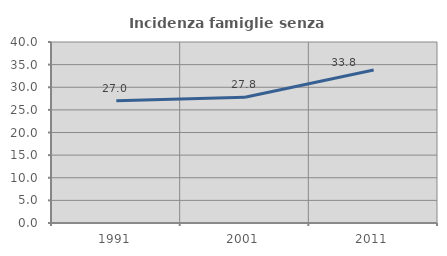
| Category | Incidenza famiglie senza nuclei |
|---|---|
| 1991.0 | 26.997 |
| 2001.0 | 27.792 |
| 2011.0 | 33.82 |